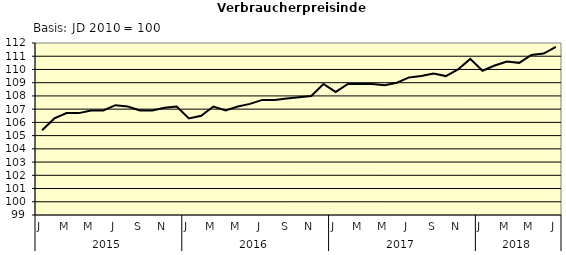
| Category | Series 0 |
|---|---|
| 0 | 105.4 |
| 1 | 106.3 |
| 2 | 106.7 |
| 3 | 106.7 |
| 4 | 106.9 |
| 5 | 106.9 |
| 6 | 107.3 |
| 7 | 107.2 |
| 8 | 106.9 |
| 9 | 106.9 |
| 10 | 107.1 |
| 11 | 107.2 |
| 12 | 106.3 |
| 13 | 106.5 |
| 14 | 107.2 |
| 15 | 106.9 |
| 16 | 107.2 |
| 17 | 107.4 |
| 18 | 107.7 |
| 19 | 107.7 |
| 20 | 107.8 |
| 21 | 107.9 |
| 22 | 108 |
| 23 | 108.9 |
| 24 | 108.3 |
| 25 | 108.9 |
| 26 | 108.9 |
| 27 | 108.9 |
| 28 | 108.8 |
| 29 | 109 |
| 30 | 109.4 |
| 31 | 109.5 |
| 32 | 109.7 |
| 33 | 109.5 |
| 34 | 110 |
| 35 | 110.8 |
| 36 | 109.9 |
| 37 | 110.3 |
| 38 | 110.6 |
| 39 | 110.5 |
| 40 | 111.1 |
| 41 | 111.2 |
| 42 | 111.7 |